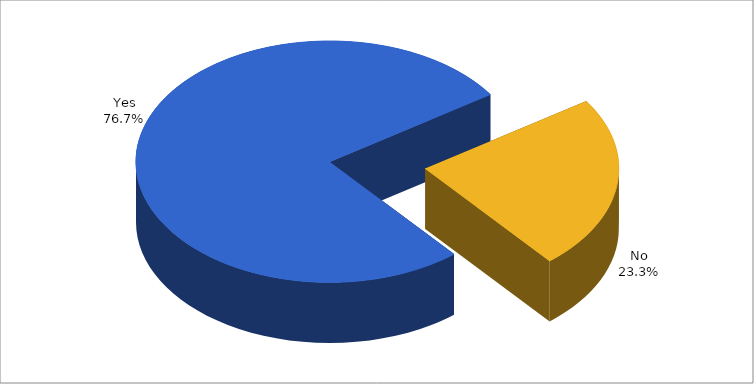
| Category | Series 0 |
|---|---|
| Yes | 0.767 |
| No | 0.233 |